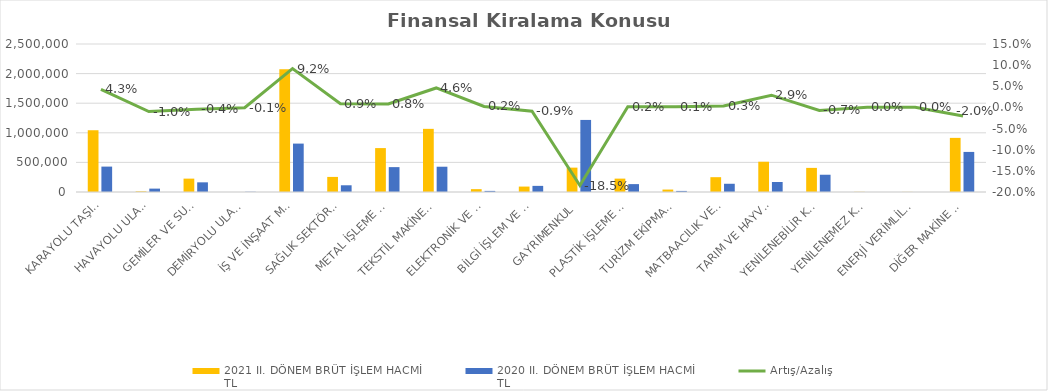
| Category | 2021 II. DÖNEM BRÜT İŞLEM HACMİ 
TL | 2020 II. DÖNEM BRÜT İŞLEM HACMİ 
TL |
|---|---|---|
| KARAYOLU TAŞITLARI | 1043165.086 | 429007.295 |
| HAVAYOLU ULAŞIM ARAÇLARI | 11001 | 57228.655 |
| GEMİLER VE SUDA YÜZEN TAŞIT VE ARAÇLAR | 225904.444 | 163239.864 |
| DEMİRYOLU ULAŞIM ARAÇLARI | 0 | 3781 |
| İŞ VE İNŞAAT MAKİNELERİ | 2071828.526 | 817643.076 |
| SAĞLIK SEKTÖRÜ VE ESTETİK EKİPMANLARI | 254809.379 | 113564.446 |
| METAL İŞLEME MAKİNELERİ | 741737.497 | 420297.022 |
| TEKSTİL MAKİNELERİ | 1066761.487 | 427044.614 |
| ELEKTRONİK VE OPTİK CİHAZLAR | 48094.247 | 18539.783 |
| BİLGİ İŞLEM VE BÜRO SİSTEMLERİ | 91734.287 | 103409.485 |
| GAYRİMENKUL | 411670.224 | 1217360.5 |
| PLASTİK İŞLEME MAKİNELERİ | 225961.195 | 133325.922 |
| TURİZM EKİPMANLARI | 41216.443 | 18162.958 |
| MATBAACILIK VE KAĞIT İŞLEME MAKİNELERİ | 250322.133 | 139063.4 |
| TARIM VE HAYVANCILIK MAKİNELERİ | 511433.156 | 168962 |
| YENİLENEBİLİR KAYNAKLI ELEKTRİK ENERJİSİ ÜRETİM EKİPMANLARI | 407364.193 | 291600.319 |
| YENİLENEMEZ KAYNAKLI ELEKTRİK ENERJİSİ ÜRETİM EKİPMANLARI | 2857 | 0 |
| ENERJİ VERİMLİLİĞİ EKİPMANLARI | 1615.427 | 0 |
| DİĞER MAKİNE VE EKİPMANLAR | 914299.381 | 676992.248 |